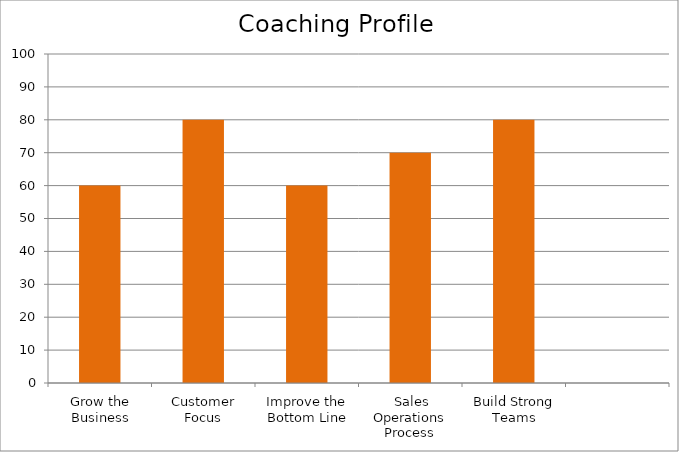
| Category | Series 0 |
|---|---|
| Grow the Business | 60 |
| Customer Focus | 80 |
| Improve the Bottom Line | 60 |
|  Sales Operations Process | 70 |
| Build Strong Teams | 80 |